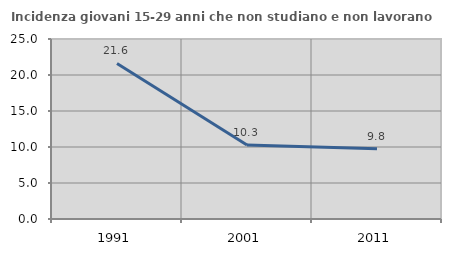
| Category | Incidenza giovani 15-29 anni che non studiano e non lavorano  |
|---|---|
| 1991.0 | 21.607 |
| 2001.0 | 10.272 |
| 2011.0 | 9.771 |